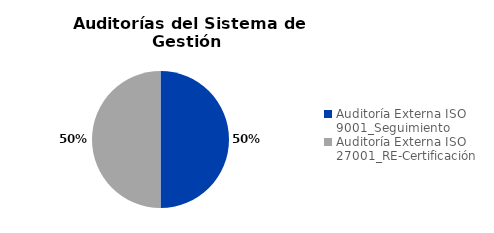
| Category | Total |
|---|---|
| Auditoría Externa ISO 9001_Seguimiento | 1 |
| Auditoría Externa ISO 27001_RE-Certificación | 1 |